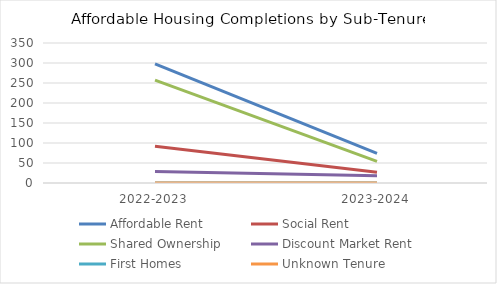
| Category | Affordable Rent | Social Rent | Shared Ownership | Discount Market Rent | First Homes | Unknown Tenure |
|---|---|---|---|---|---|---|
| 2022-2023 | 298 | 92 | 257 | 29 | 0 | 0 |
| 2023-2024 | 74 | 27 | 54 | 18 | 0 | 0 |